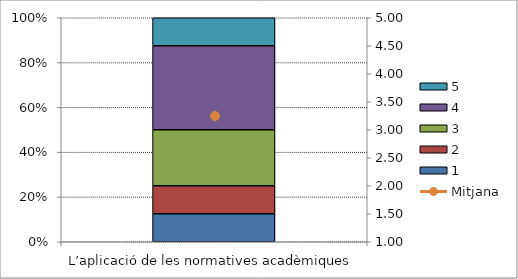
| Category | 1 | 2 | 3 | 4 | 5 |
|---|---|---|---|---|---|
| L’aplicació de les normatives acadèmiques | 1 | 1 | 2 | 3 | 1 |